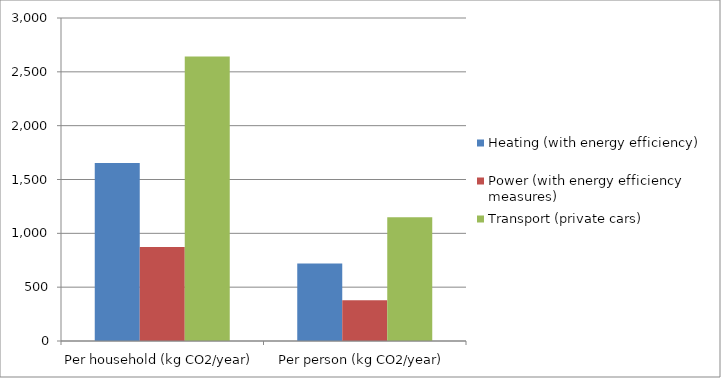
| Category | Heating (with energy efficiency) | Power (with energy efficiency measures) | Transport (private cars) |
|---|---|---|---|
| Per household (kg CO2/year) | 1654.324 | 872.626 | 2642.03 |
| Per person (kg CO2/year) | 719.271 | 379.402 | 1148.709 |